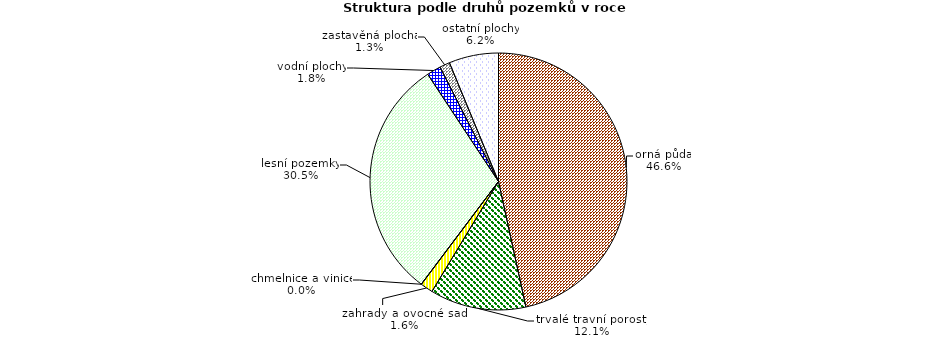
| Category | Struktura druhů pozemků |
|---|---|
| orná půda | 316504.076 |
| trvalé travní porosty | 82136.692 |
| zahrady a ovocné sady | 10825.821 |
| chmelnice a vinice | 3.246 |
| lesní pozemky | 206977.496 |
| vodní plochy | 11976.769 |
| zastavěná plocha | 8761.49 |
| ostatní plochy | 42384.966 |